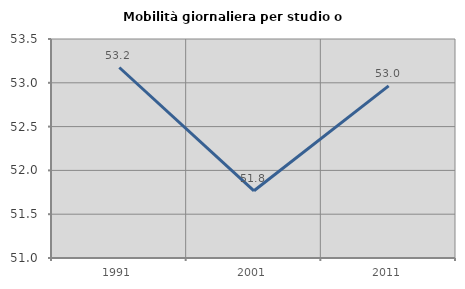
| Category | Mobilità giornaliera per studio o lavoro |
|---|---|
| 1991.0 | 53.175 |
| 2001.0 | 51.767 |
| 2011.0 | 52.965 |